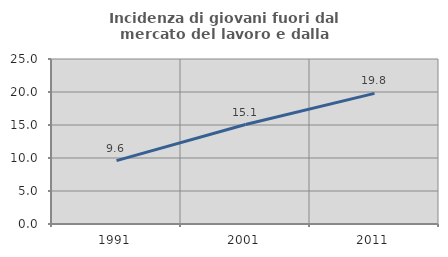
| Category | Incidenza di giovani fuori dal mercato del lavoro e dalla formazione  |
|---|---|
| 1991.0 | 9.6 |
| 2001.0 | 15.068 |
| 2011.0 | 19.792 |